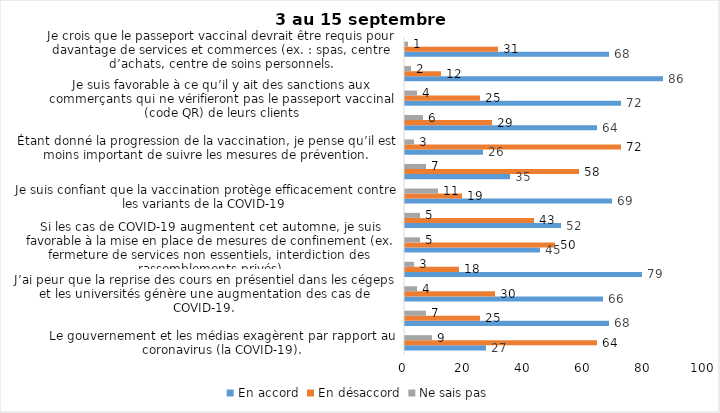
| Category | En accord | En désaccord | Ne sais pas |
|---|---|---|---|
| Le gouvernement et les médias exagèrent par rapport au coronavirus (la COVID-19). | 27 | 64 | 9 |
| J’ai peur que le système de santé soit débordé par les cas de COVID-19 suite au "déconfinement" | 68 | 25 | 7 |
| J’ai peur que la reprise des cours en présentiel dans les cégeps et les universités génère une augmentation des cas de COVID-19. | 66 | 30 | 4 |
| Je suis favorable au passeport vaccinal qui permettrait l'accès à certains lieux ou activités aux personnes vaccinées. | 79 | 18 | 3 |
| Si les cas de COVID-19 augmentent cet automne, je suis favorable à la mise en place de mesures de confinement (ex. fermeture de services non essentiels, interdiction des rassemblements privés) | 45 | 50 | 5 |
| Je suis inquiet de contracter le variant Delta de la Covid-19 | 52 | 43 | 5 |
| Je suis confiant que la vaccination protège efficacement contre les variants de la COVID-19 | 69 | 19 | 11 |
| Je suis favorable à ce que le port du masque ne soit plus obligatoire au Québec. | 35 | 58 | 7 |
| Étant donné la progression de la vaccination, je pense qu’il est moins important de suivre les mesures de prévention. | 26 | 72 | 3 |
| J'ai peur que la reprise des cours en présentiel dans les écoles primaires et secondaires génère une augmentation des cas de COVID-19 | 64 | 29 | 6 |
| Je suis favorable à ce qu’il y ait des sanctions aux commerçants qui ne vérifieront pas le passeport vaccinal (code QR) de leurs clients | 72 | 25 | 4 |
| Je suis favorable à ce qu’il y ait des sanctions aux gens qui tenteront de frauder leur passeport vaccinal par des amendes ou des accusations criminelles. | 86 | 12 | 2 |
| Je crois que le passeport vaccinal devrait être requis pour davantage de services et commerces (ex. : spas, centre d’achats, centre de soins personnels. | 68 | 31 | 1 |